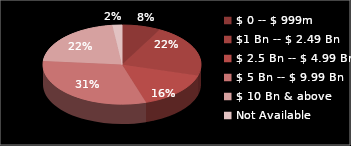
| Category | Series 0 |
|---|---|
| $ 0 -- $ 999m  | 4 |
| $1 Bn -- $ 2.49 Bn | 11 |
| $ 2.5 Bn -- $ 4.99 Bn | 8 |
| $ 5 Bn -- $ 9.99 Bn | 16 |
| $ 10 Bn & above | 11 |
| Not Available | 1 |